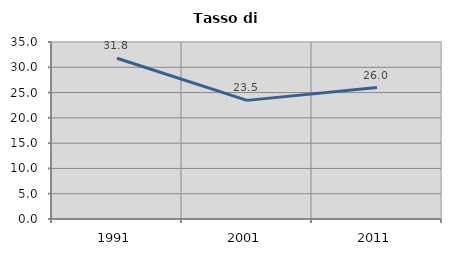
| Category | Tasso di disoccupazione   |
|---|---|
| 1991.0 | 31.789 |
| 2001.0 | 23.457 |
| 2011.0 | 25.992 |